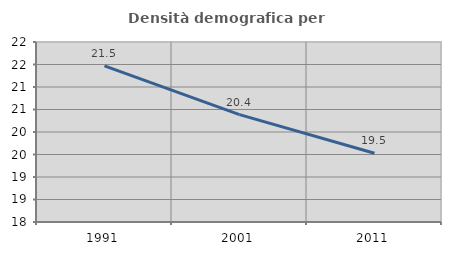
| Category | Densità demografica |
|---|---|
| 1991.0 | 21.469 |
| 2001.0 | 20.386 |
| 2011.0 | 19.528 |